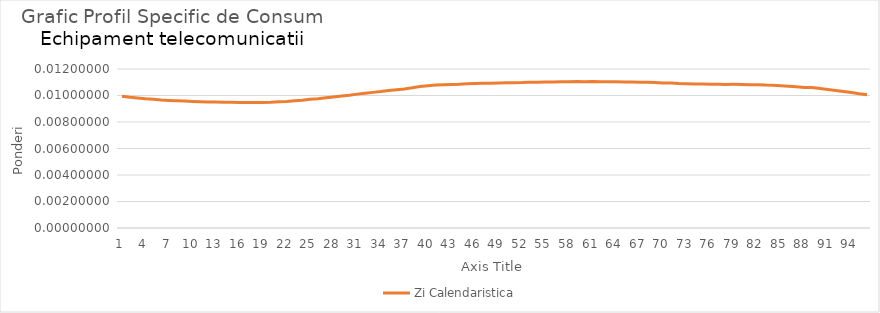
| Category | Zi Calendaristica |
|---|---|
| 0 | 0.01 |
| 1 | 0.01 |
| 2 | 0.01 |
| 3 | 0.01 |
| 4 | 0.01 |
| 5 | 0.01 |
| 6 | 0.01 |
| 7 | 0.01 |
| 8 | 0.01 |
| 9 | 0.01 |
| 10 | 0.01 |
| 11 | 0.01 |
| 12 | 0.01 |
| 13 | 0.009 |
| 14 | 0.009 |
| 15 | 0.009 |
| 16 | 0.009 |
| 17 | 0.009 |
| 18 | 0.009 |
| 19 | 0.009 |
| 20 | 0.01 |
| 21 | 0.01 |
| 22 | 0.01 |
| 23 | 0.01 |
| 24 | 0.01 |
| 25 | 0.01 |
| 26 | 0.01 |
| 27 | 0.01 |
| 28 | 0.01 |
| 29 | 0.01 |
| 30 | 0.01 |
| 31 | 0.01 |
| 32 | 0.01 |
| 33 | 0.01 |
| 34 | 0.01 |
| 35 | 0.01 |
| 36 | 0.01 |
| 37 | 0.011 |
| 38 | 0.011 |
| 39 | 0.011 |
| 40 | 0.011 |
| 41 | 0.011 |
| 42 | 0.011 |
| 43 | 0.011 |
| 44 | 0.011 |
| 45 | 0.011 |
| 46 | 0.011 |
| 47 | 0.011 |
| 48 | 0.011 |
| 49 | 0.011 |
| 50 | 0.011 |
| 51 | 0.011 |
| 52 | 0.011 |
| 53 | 0.011 |
| 54 | 0.011 |
| 55 | 0.011 |
| 56 | 0.011 |
| 57 | 0.011 |
| 58 | 0.011 |
| 59 | 0.011 |
| 60 | 0.011 |
| 61 | 0.011 |
| 62 | 0.011 |
| 63 | 0.011 |
| 64 | 0.011 |
| 65 | 0.011 |
| 66 | 0.011 |
| 67 | 0.011 |
| 68 | 0.011 |
| 69 | 0.011 |
| 70 | 0.011 |
| 71 | 0.011 |
| 72 | 0.011 |
| 73 | 0.011 |
| 74 | 0.011 |
| 75 | 0.011 |
| 76 | 0.011 |
| 77 | 0.011 |
| 78 | 0.011 |
| 79 | 0.011 |
| 80 | 0.011 |
| 81 | 0.011 |
| 82 | 0.011 |
| 83 | 0.011 |
| 84 | 0.011 |
| 85 | 0.011 |
| 86 | 0.011 |
| 87 | 0.011 |
| 88 | 0.011 |
| 89 | 0.011 |
| 90 | 0.01 |
| 91 | 0.01 |
| 92 | 0.01 |
| 93 | 0.01 |
| 94 | 0.01 |
| 95 | 0.01 |